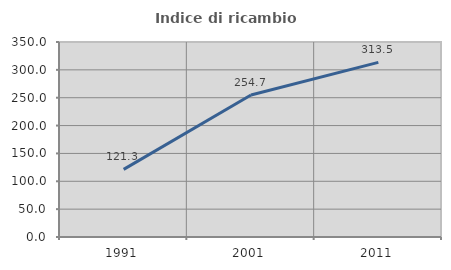
| Category | Indice di ricambio occupazionale  |
|---|---|
| 1991.0 | 121.3 |
| 2001.0 | 254.749 |
| 2011.0 | 313.483 |